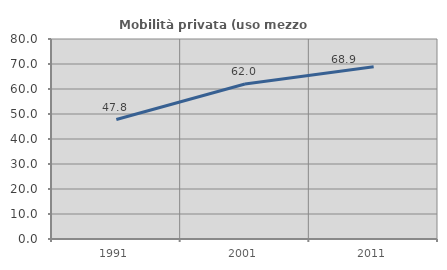
| Category | Mobilità privata (uso mezzo privato) |
|---|---|
| 1991.0 | 47.773 |
| 2001.0 | 61.996 |
| 2011.0 | 68.864 |